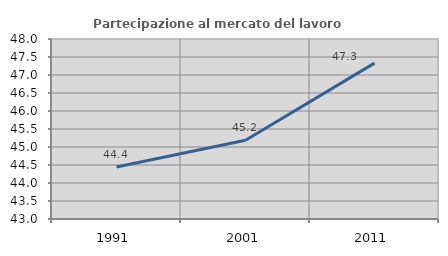
| Category | Partecipazione al mercato del lavoro  femminile |
|---|---|
| 1991.0 | 44.444 |
| 2001.0 | 45.186 |
| 2011.0 | 47.329 |